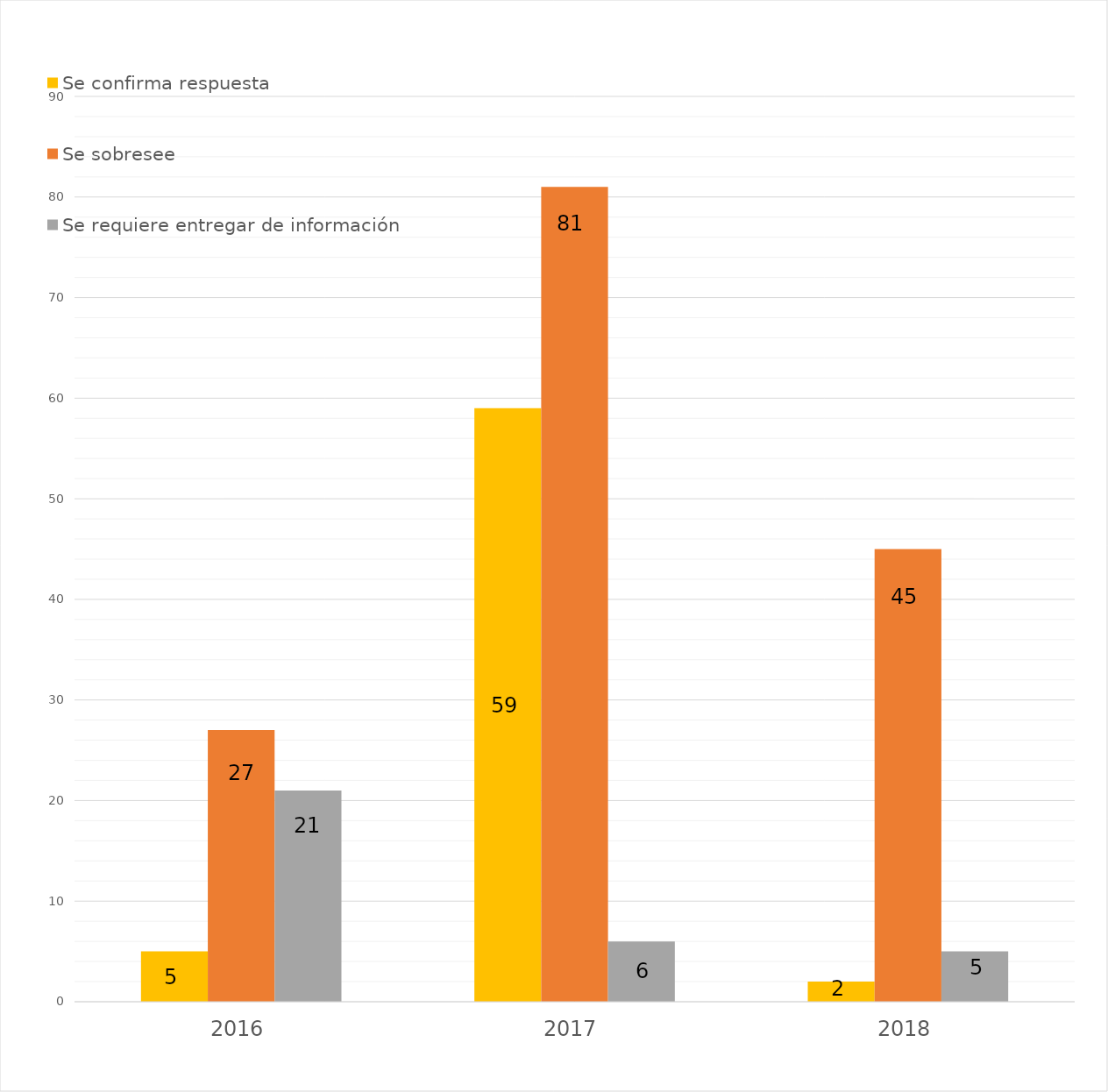
| Category | Se confirma respuesta | Se sobresee  | Se requiere entregar de información  |
|---|---|---|---|
| 2016.0 | 5 | 27 | 21 |
| 2017.0 | 59 | 81 | 6 |
| 2018.0 | 2 | 45 | 5 |